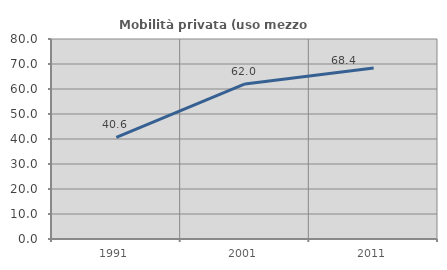
| Category | Mobilità privata (uso mezzo privato) |
|---|---|
| 1991.0 | 40.639 |
| 2001.0 | 62.017 |
| 2011.0 | 68.428 |